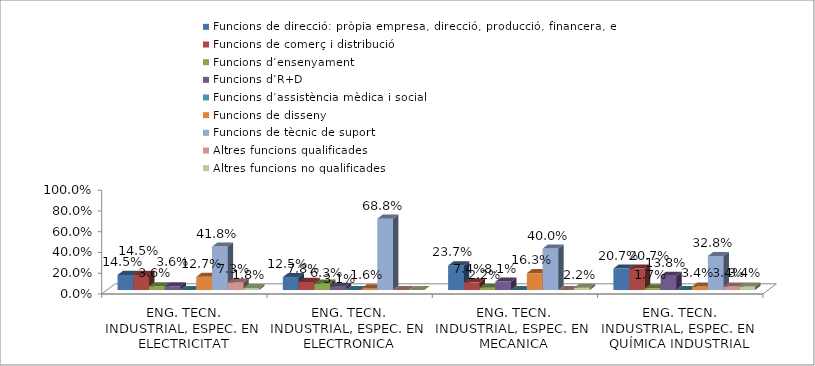
| Category | Funcions de direcció: pròpia empresa, direcció, producció, financera, etc. | Funcions de comerç i distribució | Funcions d’ensenyament | Funcions d’R+D | Funcions d’assistència mèdica i social | Funcions de disseny | Funcions de tècnic de suport | Altres funcions qualificades | Altres funcions no qualificades |
|---|---|---|---|---|---|---|---|---|---|
| ENG. TECN. INDUSTRIAL, ESPEC. EN ELECTRICITAT | 0.145 | 0.145 | 0.036 | 0.036 | 0 | 0.127 | 0.418 | 0.073 | 0.018 |
| ENG. TECN. INDUSTRIAL, ESPEC. EN ELECTRONICA INDUSTRIAL | 0.125 | 0.078 | 0.062 | 0.031 | 0 | 0.016 | 0.688 | 0 | 0 |
| ENG. TECN. INDUSTRIAL, ESPEC. EN MECANICA | 0.237 | 0.074 | 0.022 | 0.081 | 0 | 0.163 | 0.4 | 0 | 0.022 |
| ENG. TECN. INDUSTRIAL, ESPEC. EN QUÍMICA INDUSTRIAL | 0.207 | 0.207 | 0.017 | 0.138 | 0 | 0.034 | 0.328 | 0.034 | 0.034 |